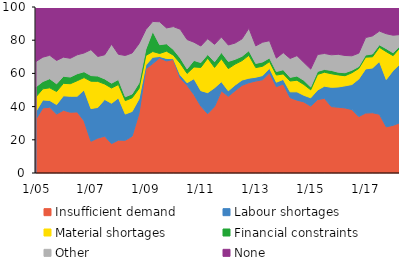
| Category | Insufficient demand | Labour shortages | Material shortages | Financial constraints | Other | None |
|---|---|---|---|---|---|---|
|  1/05 | 32.4 | 4.7 | 8.8 | 6 | 15.3 | 32.8 |
| 4 | 39.2 | 4.8 | 6.7 | 4.4 | 14.7 | 30.2 |
| 7 | 39.6 | 4.1 | 7.6 | 5.5 | 14.1 | 29.1 |
| 10 | 35.5 | 5.7 | 7.9 | 4.6 | 14.1 | 32.2 |
|  1/06 | 37.8 | 8.7 | 7.5 | 4.3 | 11.5 | 30.2 |
| 4 | 36.6 | 9.6 | 7.6 | 4 | 11.3 | 30.9 |
| 7 | 36.8 | 9.5 | 9.3 | 4.2 | 11.4 | 28.8 |
| 10 | 31.4 | 18.6 | 7.5 | 3.5 | 11.3 | 27.7 |
|  1/07 | 19.1 | 19.7 | 16.5 | 3.4 | 15.6 | 25.7 |
| 4 | 21 | 18.5 | 15.7 | 3.2 | 11.8 | 29.8 |
| 7 | 22.2 | 22.1 | 9.3 | 3.1 | 14.5 | 28.8 |
| 10 | 17.7 | 24.3 | 9.2 | 2.9 | 23.5 | 22.4 |
|  1/08 | 19.8 | 25.4 | 8.1 | 3 | 15.2 | 28.5 |
| 4 | 19.7 | 15.8 | 8.1 | 2.3 | 24.9 | 29.2 |
| 7 | 22.2 | 14.9 | 8.2 | 2.3 | 24.7 | 27.7 |
| 10 | 35.9 | 8.7 | 6.3 | 3.3 | 23.7 | 22.1 |
|  1/09 | 62.8 | 2.3 | 5.7 | 3.8 | 11.8 | 13.6 |
| 4 | 65.9 | 3.8 | 3.5 | 12.1 | 6 | 8.7 |
| 7 | 69.3 | 0.9 | 1.8 | 5.3 | 13.8 | 8.9 |
| 10 | 67.5 | 1.5 | 4.4 | 4.4 | 9.6 | 12.6 |
|  1/10 | 68.4 | 0.5 | 2.1 | 3.4 | 13.8 | 11.8 |
| 4 | 57.1 | 2 | 7 | 3.2 | 17.3 | 13.4 |
| 7 | 52.8 | 1.6 | 5.6 | 2.7 | 17.7 | 19.6 |
| 10 | 47.2 | 9.6 | 7.1 | 3.9 | 11 | 21.2 |
|  1/11 | 40.3 | 9.3 | 14 | 2.9 | 10 | 23.5 |
| 4 | 35.7 | 12.7 | 20.8 | 2.2 | 9.5 | 19.1 |
| 7 | 40 | 11.3 | 12.3 | 3.4 | 10.5 | 22.5 |
| 10 | 49.5 | 5.5 | 13.8 | 3.8 | 9.3 | 18.1 |
|  1/12 | 46.2 | 3.3 | 13.4 | 4.3 | 9.9 | 22.9 |
| 4 | 49.6 | 3.4 | 12.6 | 2.9 | 9.8 | 21.7 |
| 7 | 52.8 | 3.2 | 11.7 | 2.6 | 10.5 | 19.2 |
| 10 | 54.4 | 2.7 | 13.8 | 2.8 | 13.5 | 12.8 |
|  1/13 | 55.4 | 2.3 | 5.8 | 2.5 | 10.6 | 23.4 |
| 4 | 56.2 | 2.5 | 5.6 | 2.6 | 11.9 | 21.2 |
| 7 | 60.3 | 2.8 | 4 | 2.2 | 10.4 | 20.3 |
| 10 | 52 | 2.7 | 4.3 | 2.1 | 8.1 | 30.8 |
|  1/14 | 53.6 | 2.8 | 3.3 | 2.5 | 10.3 | 27.5 |
| 4 | 45.4 | 3.5 | 6.5 | 2.2 | 11.4 | 31 |
| 7 | 43.9 | 5 | 7 | 2.5 | 12.3 | 29.3 |
| 10 | 42.8 | 4 | 6.5 | 2.5 | 10.8 | 33.4 |
|  1/15 | 40.3 | 5 | 4.8 | 1.7 | 10.8 | 37.4 |
| 4 | 44.2 | 5.8 | 9.4 | 1.8 | 10.2 | 28.6 |
| 7 | 45 | 7.3 | 8.4 | 1.7 | 9.6 | 28 |
| 10 | 40 | 11.6 | 8.2 | 2 | 9.4 | 28.8 |
|  1/16 | 39.6 | 12.2 | 7.3 | 1.6 | 10.8 | 28.5 |
| 4 | 39.2 | 13.3 | 6.1 | 1.8 | 10.4 | 29.2 |
| 7 | 38.2 | 15.1 | 7.1 | 1.5 | 8.7 | 29.4 |
| 10 | 34 | 22.6 | 6.4 | 1.1 | 8.1 | 27.8 |
|  1/17 | 36.1 | 26.6 | 7.1 | 1.3 | 10.5 | 18.4 |
| 4 | 36.3 | 27 | 6.7 | 1.7 | 10.9 | 17.4 |
| 7 | 35.4 | 31.8 | 8.5 | 1.5 | 8.3 | 14.5 |
| 10 | 27.8 | 28.5 | 16.8 | 1.8 | 9 | 16.1 |
|  1/18 | 28.7 | 33 | 9 | 1.7 | 10.6 | 17 |
| 4 | 30.3 | 35.4 | 9.8 | 1.1 | 6.8 | 16.6 |